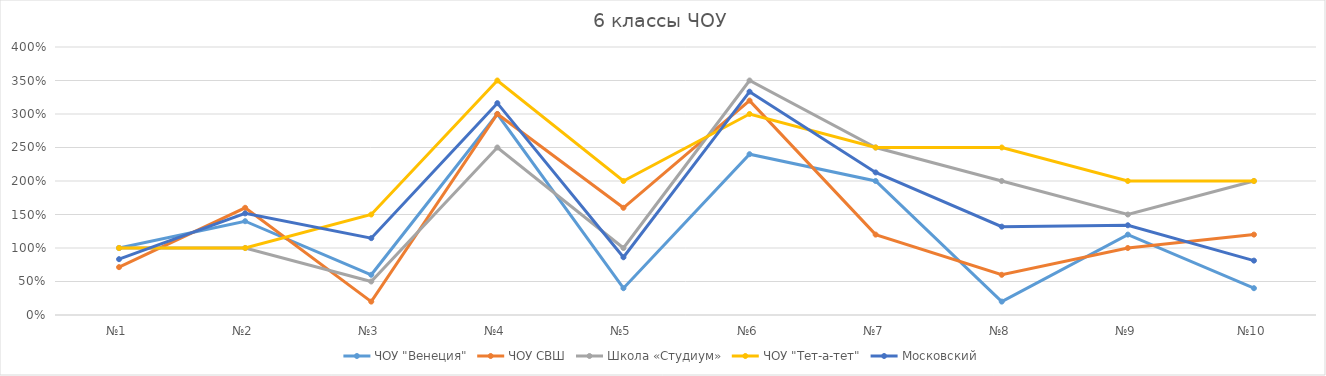
| Category | ЧОУ "Венеция" | ЧОУ СВШ | Школа «Студиум» | ЧОУ "Тет-а-тет" | Московский |
|---|---|---|---|---|---|
| №1 | 1 | 0.714 | 1 | 1 | 0.833 |
| №2 | 1.4 | 1.6 | 1 | 1 | 1.517 |
| №3 | 0.6 | 0.2 | 0.5 | 1.5 | 1.147 |
| №4 | 3 | 3 | 2.5 | 3.5 | 3.162 |
| №5 | 0.4 | 1.6 | 1 | 2 | 0.862 |
| №6 | 2.4 | 3.2 | 3.5 | 3 | 3.333 |
| №7 | 2 | 1.2 | 2.5 | 2.5 | 2.128 |
| №8 | 0.2 | 0.6 | 2 | 2.5 | 1.319 |
| №9 | 1.2 | 1 | 1.5 | 2 | 1.339 |
| №10 | 0.4 | 1.2 | 2 | 2 | 0.812 |